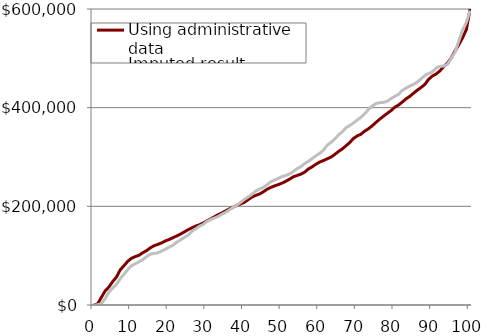
| Category | Using administrative data | Imputed result |
|---|---|---|
| 0.0 | 0 | 0 |
| 1.0 | 2174.243 | 353.563 |
| 2.0 | 15612.023 | 2750.28 |
| 3.0 | 28624.483 | 13024.426 |
| 4.0 | 36619.901 | 26235.742 |
| 5.0 | 47413.003 | 34298.318 |
| 6.0 | 56683.284 | 41738.59 |
| 7.0 | 71157.248 | 53212.946 |
| 8.0 | 79731.434 | 62139.871 |
| 9.0 | 88592.268 | 71632.54 |
| 10.0 | 94737.219 | 79710.342 |
| 11.0 | 98105.547 | 83627.618 |
| 12.0 | 100766.78 | 87584.501 |
| 13.0 | 106086.327 | 91895.396 |
| 14.0 | 110187.053 | 98023.052 |
| 15.0 | 115891.744 | 103062.931 |
| 16.0 | 120115.404 | 104454.994 |
| 17.0 | 122832.017 | 105847.565 |
| 18.0 | 125886.426 | 109287.381 |
| 19.0 | 129870.807 | 113090.431 |
| 20.0 | 132847.544 | 117286.532 |
| 21.0 | 136330.437 | 121117.303 |
| 22.0 | 139940.756 | 127172.408 |
| 23.0 | 143681.859 | 131767.587 |
| 24.0 | 147970.682 | 136758.638 |
| 25.0 | 152501.02 | 141100.444 |
| 26.0 | 156132.174 | 149165.933 |
| 27.0 | 159813.236 | 153914.869 |
| 28.0 | 162442.813 | 159421.931 |
| 29.0 | 165949.321 | 162881.785 |
| 30.0 | 170335.953 | 169207.699 |
| 31.0 | 174413.117 | 173046.05 |
| 32.0 | 178582.683 | 176082.478 |
| 33.0 | 183102.082 | 179377.684 |
| 34.0 | 186479.403 | 183933.474 |
| 35.0 | 190600.538 | 187784.591 |
| 36.0 | 194885.754 | 192791.896 |
| 37.0 | 198230.316 | 198136.719 |
| 38.0 | 201955.82 | 202055.858 |
| 39.0 | 204800.606 | 207993.957 |
| 40.0 | 208153.663 | 214126.4 |
| 41.0 | 213528.288 | 218930.128 |
| 42.0 | 218718.483 | 224161.057 |
| 43.0 | 222165.026 | 230968.679 |
| 44.0 | 224851.341 | 235127.345 |
| 45.0 | 229155.454 | 238343.241 |
| 46.0 | 234543.133 | 243521.411 |
| 47.0 | 238274.531 | 249805.044 |
| 48.0 | 241343.46 | 253055.809 |
| 49.0 | 243995.525 | 256466.322 |
| 50.0 | 247040.261 | 260228.583 |
| 51.0 | 250783.843 | 262623.099 |
| 52.0 | 255009.612 | 265675.452 |
| 53.0 | 259815.639 | 270570.503 |
| 54.0 | 262524.603 | 276338.988 |
| 55.0 | 265205.657 | 280521.689 |
| 56.0 | 269164.269 | 286525.918 |
| 57.0 | 275632.553 | 291130.11 |
| 58.0 | 279996.327 | 296678 |
| 59.0 | 285202.6 | 302565.076 |
| 60.0 | 289661.047 | 307239.461 |
| 61.0 | 292768.637 | 313802.93 |
| 62.0 | 296250.161 | 323790.411 |
| 63.0 | 299729.141 | 329569.335 |
| 64.0 | 305034.228 | 336116.841 |
| 65.0 | 311112.026 | 344677.63 |
| 66.0 | 316156.451 | 350775.683 |
| 67.0 | 322638.581 | 359234.239 |
| 68.0 | 329260.7 | 363852.213 |
| 69.0 | 337658.062 | 369036.503 |
| 70.0 | 342732.136 | 375029.656 |
| 71.0 | 346225.645 | 380551.734 |
| 72.0 | 352624.956 | 387759.214 |
| 73.0 | 357324.452 | 396762.975 |
| 74.0 | 363398.438 | 403471.058 |
| 75.0 | 370262.789 | 408484.073 |
| 76.0 | 376785.279 | 410128.072 |
| 77.0 | 382785.282 | 410758.826 |
| 78.0 | 388609.018 | 413021.931 |
| 79.0 | 394136.758 | 418586.041 |
| 80.0 | 401109.792 | 423120.605 |
| 81.0 | 405403.189 | 427138.91 |
| 82.0 | 411534.14 | 435059.869 |
| 83.0 | 418122.358 | 439873.279 |
| 84.0 | 423038.322 | 443790.157 |
| 85.0 | 429684.708 | 447335.26 |
| 86.0 | 435671.303 | 452265.438 |
| 87.0 | 441121.148 | 458521.295 |
| 88.0 | 447373.217 | 465666.169 |
| 89.0 | 457704.265 | 469340.936 |
| 90.0 | 464325.975 | 472740.279 |
| 91.0 | 468471.29 | 480675.93 |
| 92.0 | 474731.366 | 483573.888 |
| 93.0 | 483515.243 | 484601.13 |
| 94.0 | 490227.059 | 487756.894 |
| 95.0 | 501058.518 | 500401.029 |
| 96.0 | 514975.663 | 512313.512 |
| 97.0 | 527735.187 | 535435.125 |
| 98.0 | 541723.819 | 557760.578 |
| 99.0 | 558286.999 | 572773.805 |
| 100.0 | 600051.912 | 596804.665 |